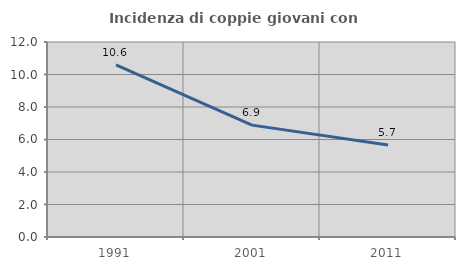
| Category | Incidenza di coppie giovani con figli |
|---|---|
| 1991.0 | 10.588 |
| 2001.0 | 6.884 |
| 2011.0 | 5.66 |